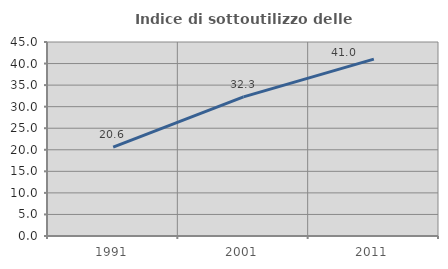
| Category | Indice di sottoutilizzo delle abitazioni  |
|---|---|
| 1991.0 | 20.619 |
| 2001.0 | 32.258 |
| 2011.0 | 41.026 |